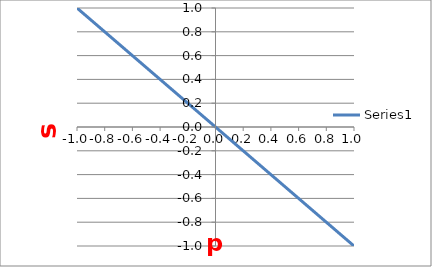
| Category | Series 0 |
|---|---|
| 0.9999999999999999 | -1 |
| 0.9982259296093189 | -0.998 |
| 0.9929100130887779 | -0.993 |
| 0.9840711120585738 | -0.984 |
| 0.9717405881839144 | -0.972 |
| 0.9559621918994149 | -0.956 |
| 0.9367919071763967 | -0.937 |
| 0.9142977528838759 | -0.914 |
| 0.8885595414480402 | -0.889 |
| 0.8596685956665243 | -0.86 |
| 0.8277274246822677 | -0.828 |
| 0.7928493602666441 | -0.793 |
| 0.7551581547023816 | -0.755 |
| 0.7147875416930415 | -0.715 |
| 0.6718807618570105 | -0.672 |
| 0.6265900544896222 | -0.627 |
| 0.5790761173967033 | -0.579 |
| 0.5295075367161364 | -0.53 |
| 0.47806018875050854 | -0.478 |
| 0.424916615933229 | -0.425 |
| 0.37026537914227853 | -0.37 |
| 0.31430038865966686 | -0.314 |
| 0.2572202161504539 | -0.257 |
| 0.1992273901025267 | -0.199 |
| 0.14052767722701243 | -0.141 |
| 0.08132935236901889 | -0.081 |
| 0.021842459519163287 | -0.022 |
| -0.03772193345207795 | 0.038 |
| -0.09715248369288583 | 0.097 |
| -0.15623832324429213 | 0.156 |
| -0.21476980722938419 | 0.215 |
| -0.27253925770284015 | 0.273 |
| -0.32934170052151873 | 0.329 |
| -0.3849755926215733 | 0.385 |
| -0.43924353712161873 | 0.439 |
| -0.49195298371465274 | 0.492 |
| -0.542916911863656 | 0.543 |
| -0.5919544943767852 | 0.592 |
| -0.6388917390077054 | 0.639 |
| -0.6835621058045767 | 0.684 |
| -0.7258070980172493 | 0.726 |
| -0.7654768244660445 | 0.765 |
| -0.8024305313767646 | 0.802 |
| -0.8365371017948963 | 0.837 |
| -0.8676755208070274 | 0.868 |
| -0.8957353049187933 | 0.896 |
| -0.9206168940658711 | 0.921 |
| -0.942232004867103 | 0.942 |
| -0.9605039438663611 | 0.961 |
| -0.9753678796517279 | 0.975 |
| -0.9867710728864718 | 0.987 |
| -0.9946730634356388 | 0.995 |
| -0.9990458139243074 | 0.999 |
| -0.999873809218142 | 1 |
| -0.9971541114732739 | 0.997 |
| -0.9908963705601846 | 0.991 |
| -0.981122789824607 | 0.981 |
| -0.967868047306929 | 0.968 |
| -0.951179172699624 | 0.951 |
| -0.931115380479281 | 0.931 |
| -0.9077478598053061 | 0.908 |
| -0.8811595219307621 | 0.881 |
| -0.8514447060215696 | 0.851 |
| -0.8187088444278674 | 0.819 |
| -0.7830680885951884 | 0.783 |
| -0.744648896942782 | 0.745 |
| -0.7035875861713367 | 0.704 |
| -0.6600298475921363 | 0.66 |
| -0.6141302301937781 | 0.614 |
| -0.5660515922806024 | 0.566 |
| -0.515964523628501 | 0.516 |
| -0.4640467402083773 | 0.464 |
| -0.410482453624862 | 0.41 |
| -0.35546171750760597 | 0.355 |
| -0.29917975317424905 | 0.299 |
| -0.24183625695769673 | 0.242 |
| -0.18363469165541996 | 0.184 |
| -0.12478156461480862 | 0.125 |
| -0.06548569501602529 | 0.065 |
| -0.005957472952158888 | 0.006 |
| 0.05359188706444205 | -0.054 |
| 0.11295109552099948 | -0.113 |
| 0.17190953758923933 | -0.172 |
| 0.2302580204164537 | -0.23 |
| 0.2877895153711936 | -0.288 |
| 0.3442998926099957 | -0.344 |
| 0.39958864535880967 | -0.4 |
| 0.45345960133925767 | -0.453 |
| 0.5057216188154927 | -0.506 |
| 0.5561892647919922 | -0.556 |
| 0.6046834729559274 | -0.605 |
| 0.6510321790296526 | -0.651 |
| 0.6950709312789831 | -0.695 |
| 0.7366434740111033 | -0.737 |
| 0.775602301991761 | -0.776 |
| 0.8118091838146029 | -0.812 |
| 0.8451356523656678 | -0.845 |
| 0.8754634606427911 | -0.875 |
| 0.9026850013126154 | -0.903 |
| 0.9267036885165585 | -0.927 |
| 0.9474343005710376 | -0.947 |
| 0.9648032823459991 | -0.965 |
| 0.9787490062488767 | -0.979 |
| 0.989221990887965 | -0.989 |
| 0.9961850766393637 | -0.996 |
| 0.9996135574945539 | -1 |
| 0.9994952687207951 | -0.999 |
| 0.9958306300233096 | -0.996 |
| 0.988632644056109 | -0.989 |
| 0.9779268502867471 | -0.978 |
| 0.9637512343786937 | -0.964 |
| 0.946156093412853 | -0.946 |
| 0.9252038574264402 | -0.925 |
| 0.9009688679024191 | -0.901 |
| 0.8735371139954559 | -0.874 |
| 0.843005927430292 | -0.843 |
| 0.8094836371550828 | -0.809 |
| 0.7730891849750371 | -0.773 |
| 0.7339517035301526 | -0.734 |
| 0.6922100581144227 | -0.692 |
| 0.6480123539622279 | -0.648 |